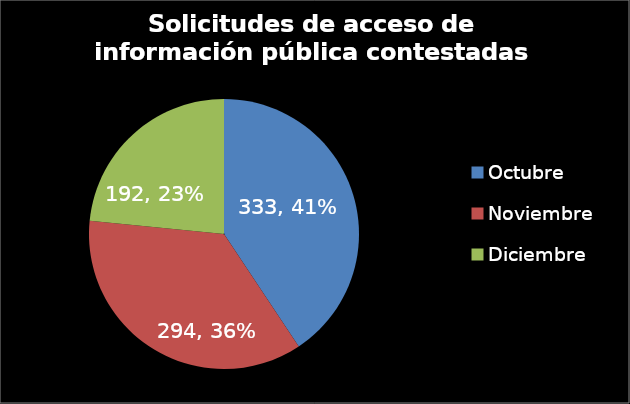
| Category | Series 0 |
|---|---|
| Octubre | 333 |
| Noviembre | 294 |
| Diciembre | 192 |